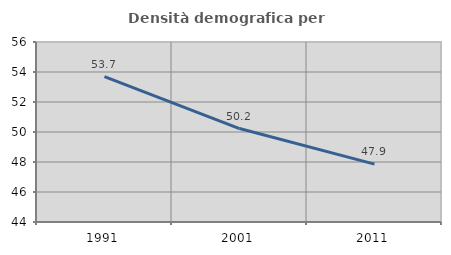
| Category | Densità demografica |
|---|---|
| 1991.0 | 53.698 |
| 2001.0 | 50.231 |
| 2011.0 | 47.86 |